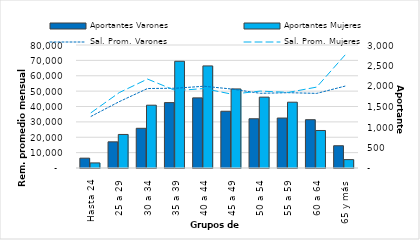
| Category | Aportantes Varones | Aportantes Mujeres |
|---|---|---|
| Hasta 24 | 240 | 124 |
| 25 a 29 | 638 | 818 |
| 30 a 34 | 968 | 1532 |
| 35 a 39 | 1595 | 2603 |
| 40 a 44 | 1710 | 2490 |
| 45 a 49 | 1384 | 1928 |
| 50 a 54 | 1201 | 1728 |
| 55 a 59 | 1218 | 1605 |
| 60 a 64 | 1178 | 915 |
| 65 y más | 543 | 205 |